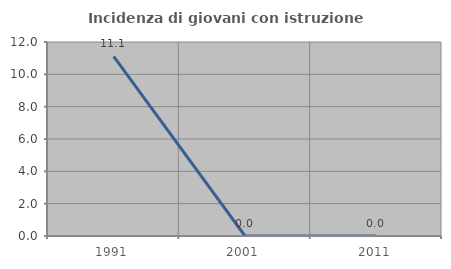
| Category | Incidenza di giovani con istruzione universitaria |
|---|---|
| 1991.0 | 11.111 |
| 2001.0 | 0 |
| 2011.0 | 0 |